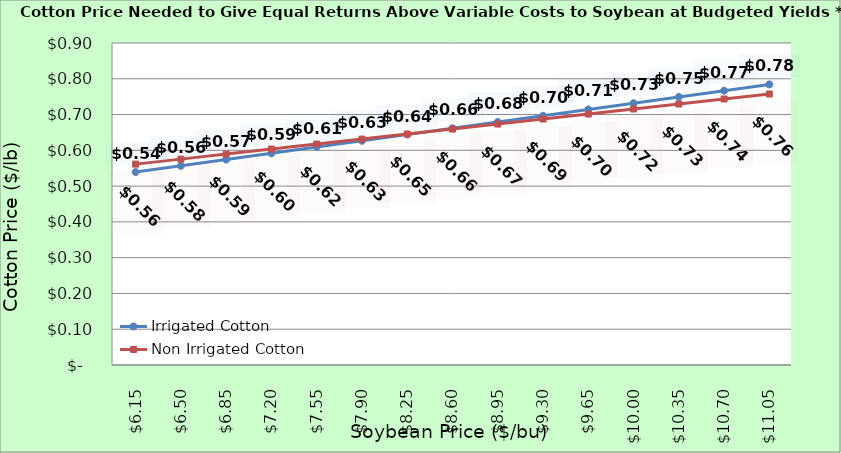
| Category | Irrigated Cotton | Non Irrigated Cotton |
|---|---|---|
| 6.150000000000002 | 0.539 | 0.561 |
| 6.500000000000002 | 0.557 | 0.575 |
| 6.850000000000001 | 0.574 | 0.589 |
| 7.200000000000001 | 0.592 | 0.603 |
| 7.550000000000001 | 0.609 | 0.617 |
| 7.9 | 0.627 | 0.631 |
| 8.25 | 0.644 | 0.645 |
| 8.6 | 0.662 | 0.659 |
| 8.95 | 0.679 | 0.673 |
| 9.299999999999999 | 0.697 | 0.687 |
| 9.649999999999999 | 0.714 | 0.701 |
| 9.999999999999998 | 0.732 | 0.715 |
| 10.349999999999998 | 0.749 | 0.729 |
| 10.699999999999998 | 0.767 | 0.743 |
| 11.049999999999997 | 0.784 | 0.757 |